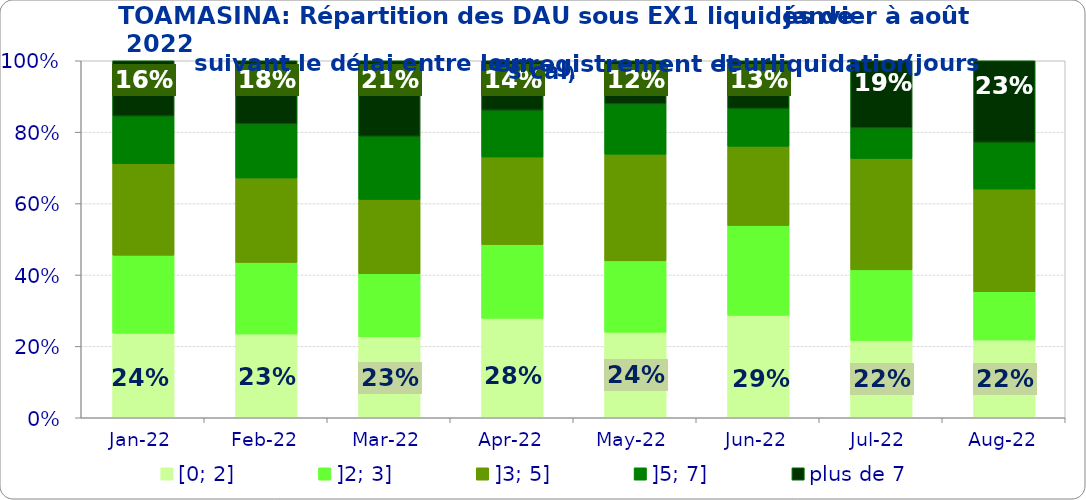
| Category | [0; 2] | ]2; 3] | ]3; 5] | ]5; 7] | plus de 7 |
|---|---|---|---|---|---|
| 2022-01-01 | 0.237 | 0.219 | 0.256 | 0.133 | 0.155 |
| 2022-02-01 | 0.235 | 0.2 | 0.236 | 0.152 | 0.177 |
| 2022-03-01 | 0.227 | 0.177 | 0.208 | 0.177 | 0.212 |
| 2022-04-01 | 0.278 | 0.207 | 0.245 | 0.131 | 0.138 |
| 2022-05-01 | 0.24 | 0.2 | 0.299 | 0.141 | 0.121 |
| 2022-06-01 | 0.287 | 0.251 | 0.222 | 0.106 | 0.134 |
| 2022-07-01 | 0.217 | 0.198 | 0.312 | 0.086 | 0.188 |
| 2022-08-01 | 0.218 | 0.135 | 0.288 | 0.131 | 0.228 |